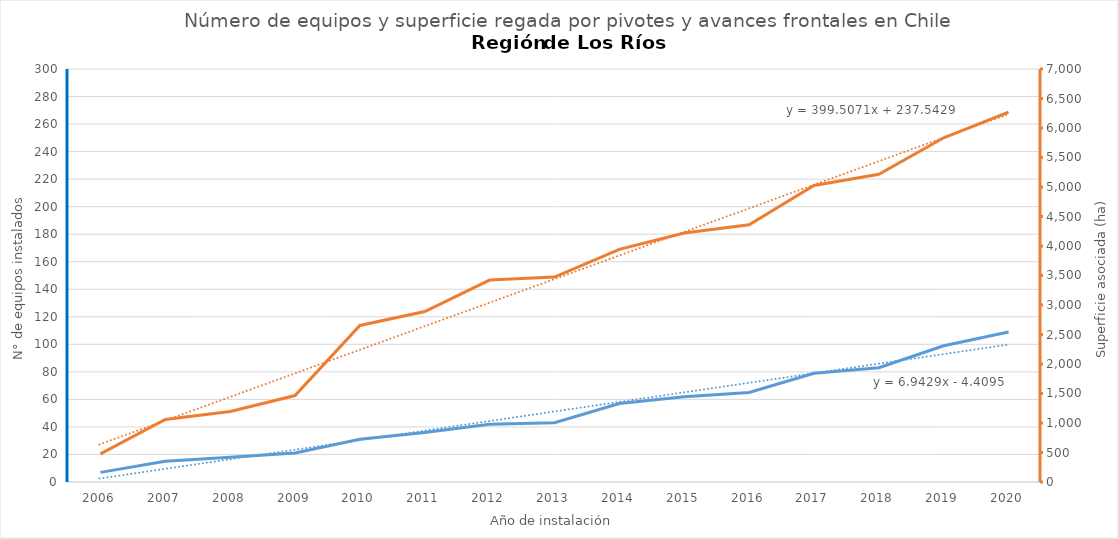
| Category | N° |
|---|---|
| 2006.0 | 7 |
| 2007.0 | 15 |
| 2008.0 | 18 |
| 2009.0 | 21 |
| 2010.0 | 31 |
| 2011.0 | 36 |
| 2012.0 | 42 |
| 2013.0 | 43 |
| 2014.0 | 57 |
| 2015.0 | 62 |
| 2016.0 | 65 |
| 2017.0 | 79 |
| 2018.0 | 83 |
| 2019.0 | 99 |
| 2020.0 | 109 |